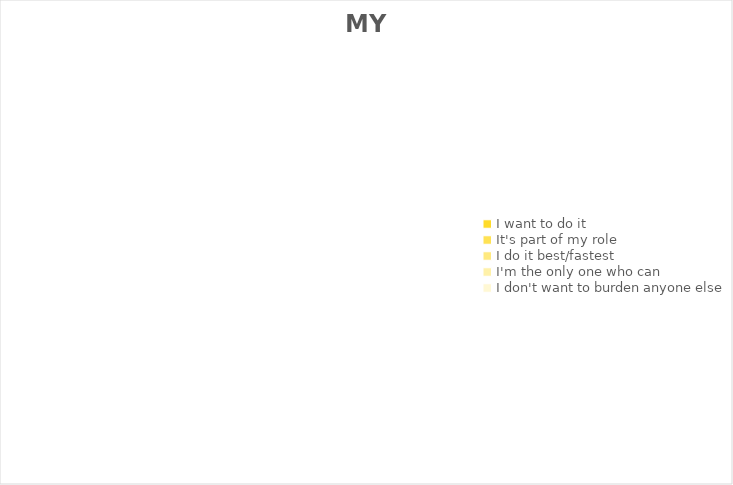
| Category | Series 0 |
|---|---|
| I want to do it | 0 |
| It's part of my role | 0 |
| I do it best/fastest | 0 |
| I'm the only one who can | 0 |
| I don't want to burden anyone else | 0 |